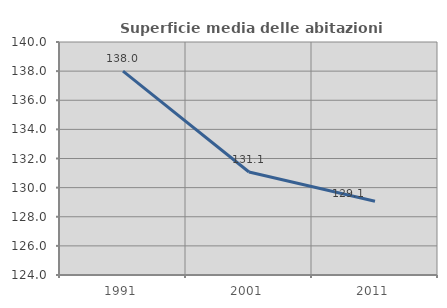
| Category | Superficie media delle abitazioni occupate |
|---|---|
| 1991.0 | 138 |
| 2001.0 | 131.076 |
| 2011.0 | 129.068 |